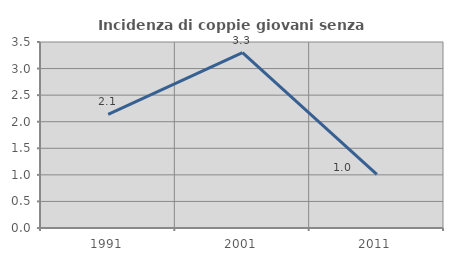
| Category | Incidenza di coppie giovani senza figli |
|---|---|
| 1991.0 | 2.137 |
| 2001.0 | 3.302 |
| 2011.0 | 1.01 |